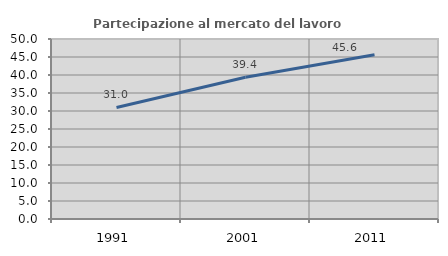
| Category | Partecipazione al mercato del lavoro  femminile |
|---|---|
| 1991.0 | 30.976 |
| 2001.0 | 39.356 |
| 2011.0 | 45.644 |